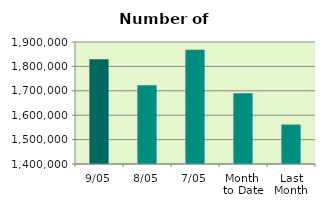
| Category | Series 0 |
|---|---|
| 9/05 | 1829330 |
| 8/05 | 1722342 |
| 7/05 | 1868166 |
| Month 
to Date | 1689657.667 |
| Last
Month | 1561575.6 |